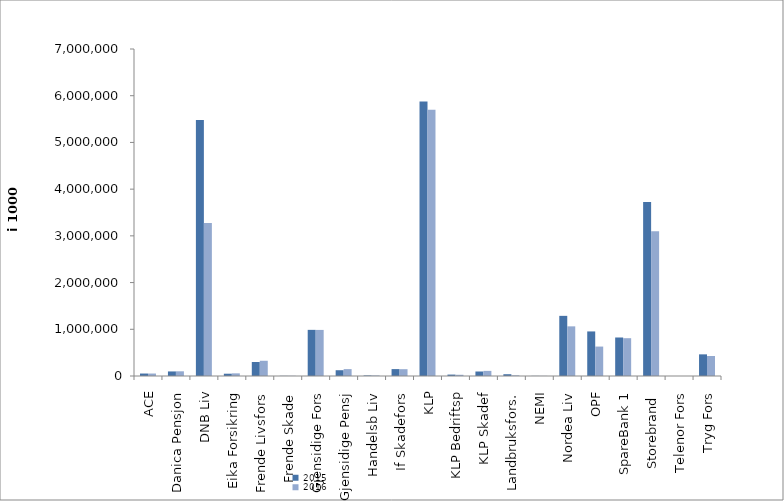
| Category | 2015 | 2016 |
|---|---|---|
| ACE | 52816.702 | 52816.702 |
| Danica Pensjon | 97687.32 | 100639.044 |
| DNB Liv | 5481685.303 | 3273720 |
| Eika Forsikring | 49042 | 56721 |
| Frende Livsfors | 299226 | 325972 |
| Frende Skade | 3480 | 4236 |
| Gjensidige Fors | 987747 | 986467 |
| Gjensidige Pensj | 123718.288 | 147498.912 |
| Handelsb Liv | 11333 | 11212 |
| If Skadefors | 147798 | 145904 |
| KLP | 5877832.721 | 5698583.12 |
| KLP Bedriftsp | 30420 | 26138 |
| KLP Skadef | 96446 | 109496 |
| Landbruksfors. | 38159 | 13859 |
| NEMI | 2609 | 2609 |
| Nordea Liv | 1287510.924 | 1062843.244 |
| OPF | 954015 | 630132 |
| SpareBank 1 | 824354.572 | 809372.635 |
| Storebrand  | 3722909.789 | 3101227.945 |
| Telenor Fors | 0 | 0 |
| Tryg Fors | 463361.023 | 427849.4 |